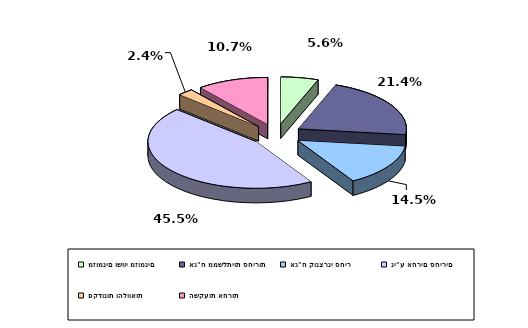
| Category | Series 0 |
|---|---|
| מזומנים ושווי מזומנים | 0.056 |
| אג"ח ממשלתיות סחירות | 0.214 |
| אג"ח קונצרני סחיר | 0.145 |
| ני"ע אחרים סחירים | 0.455 |
| פקדונות והלוואות | 0.024 |
| השקעות אחרות | 0.107 |